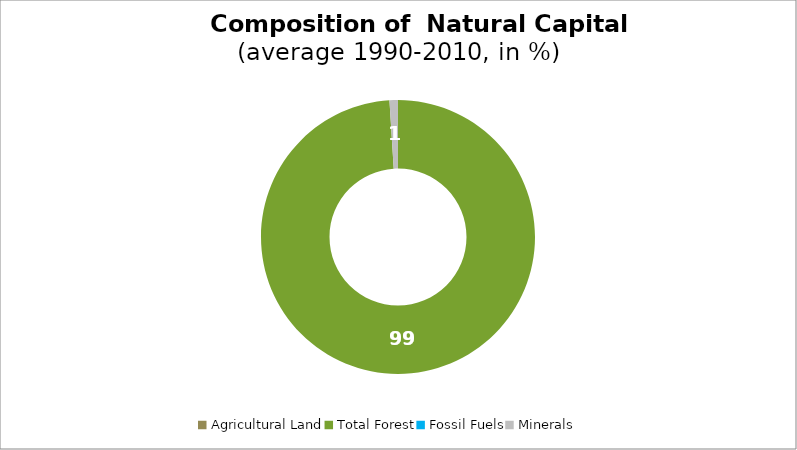
| Category | Series 0 |
|---|---|
| Agricultural Land | 0 |
| Total Forest | 99.006 |
| Fossil Fuels | 0 |
| Minerals | 0.994 |